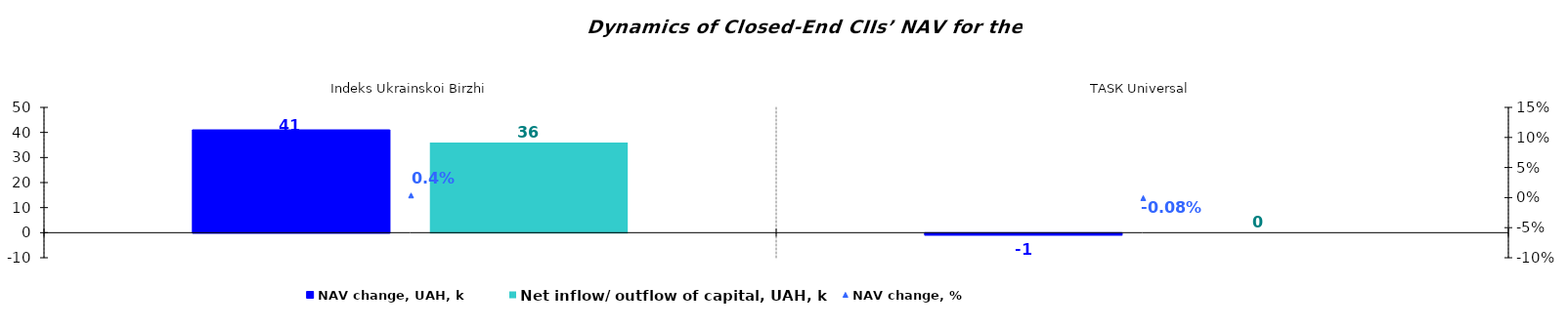
| Category | NAV change, UAH, k | Net inflow/ outflow of capital, UAH, k |
|---|---|---|
| Іndeks Ukrainskoi Birzhi | 41.029 | 35.947 |
| ТАSК Universal | -0.771 | 0 |